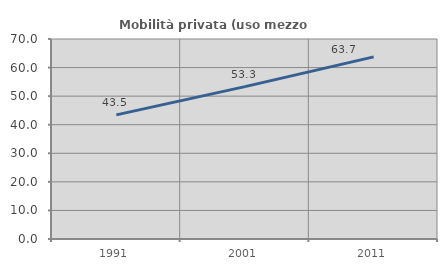
| Category | Mobilità privata (uso mezzo privato) |
|---|---|
| 1991.0 | 43.451 |
| 2001.0 | 53.333 |
| 2011.0 | 63.743 |